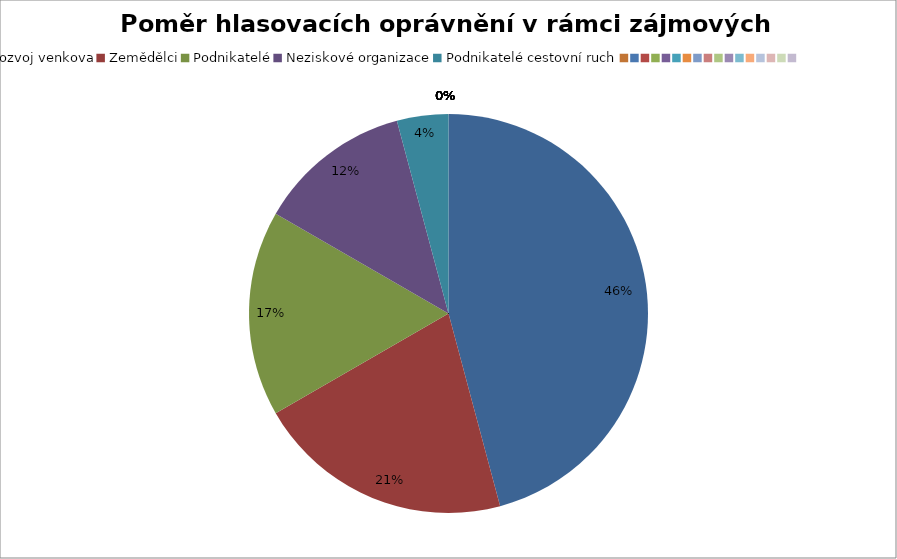
| Category | Series 0 |
|---|---|
| Rozvoj venkova | 0.458 |
| Zemědělci | 0.208 |
| Podnikatelé | 0.167 |
| Neziskové organizace | 0.125 |
| Podnikatelé cestovní ruch | 0.042 |